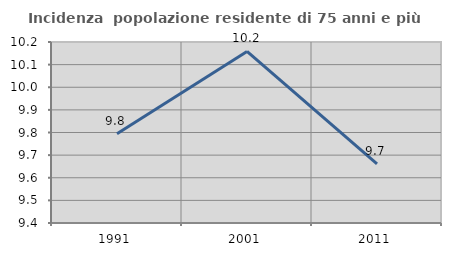
| Category | Incidenza  popolazione residente di 75 anni e più |
|---|---|
| 1991.0 | 9.795 |
| 2001.0 | 10.158 |
| 2011.0 | 9.661 |